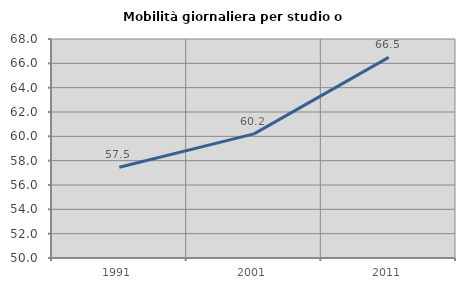
| Category | Mobilità giornaliera per studio o lavoro |
|---|---|
| 1991.0 | 57.46 |
| 2001.0 | 60.205 |
| 2011.0 | 66.486 |